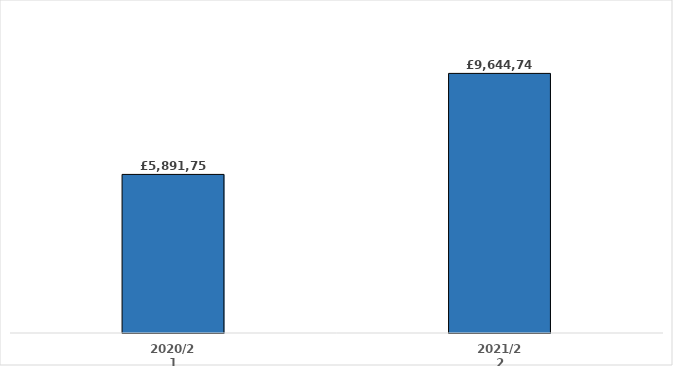
| Category | Series 0 |
|---|---|
| 2020/21 | 5891751.131 |
| 2021/22 | 9644742.948 |